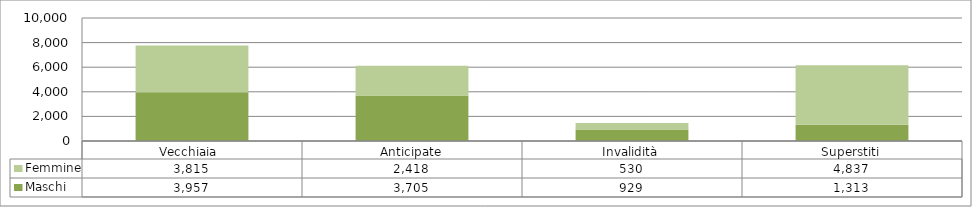
| Category | Maschi | Femmine |
|---|---|---|
| Vecchiaia  | 3957 | 3815 |
| Anticipate | 3705 | 2418 |
| Invalidità | 929 | 530 |
| Superstiti | 1313 | 4837 |